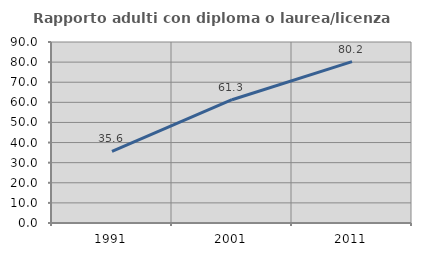
| Category | Rapporto adulti con diploma o laurea/licenza media  |
|---|---|
| 1991.0 | 35.583 |
| 2001.0 | 61.304 |
| 2011.0 | 80.242 |